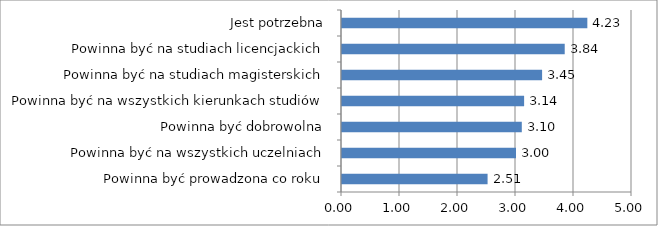
| Category | średnia wartość |
|---|---|
| Powinna być prowadzona co roku | 2.51 |
| Powinna być na wszystkich uczelniach | 3 |
| Powinna być dobrowolna | 3.1 |
| Powinna być na wszystkich kierunkach studiów | 3.14 |
| Powinna być na studiach magisterskich | 3.45 |
| Powinna być na studiach licencjackich | 3.84 |
| Jest potrzebna | 4.23 |